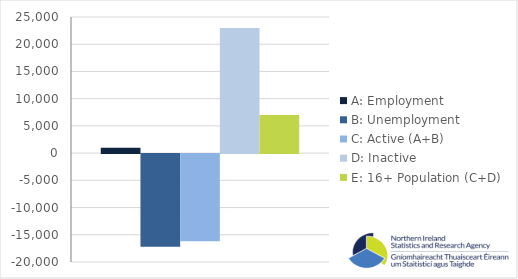
| Category | A: Employment | B: Unemployment | C: Active (A+B) | D: Inactive | E: 16+ Population (C+D) |
|---|---|---|---|---|---|
| 0 | 1000 | -17000 | -16000 | 23000 | 7000 |